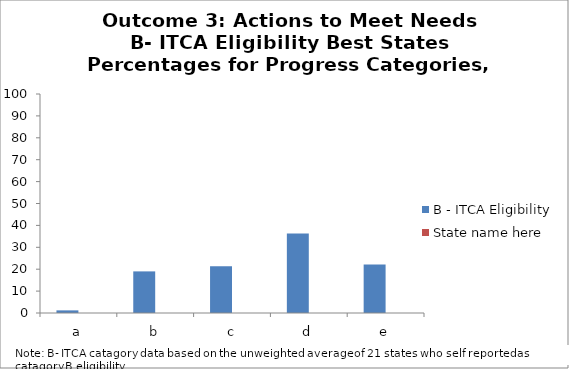
| Category | B - ITCA Eligibility | State name here |
|---|---|---|
| a | 1.2 |  |
| b | 19 |  |
| c | 21.3 |  |
| d | 36.3 |  |
| e | 22.2 |  |